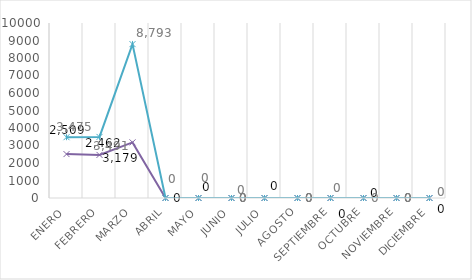
| Category | Series 0 | Series 1 | Series 2 | Series 3 | Series 4 |
|---|---|---|---|---|---|
| Enero |  |  |  | 2509 | 3475 |
| Febrero |  |  |  | 2462 | 3491 |
| Marzo |  |  |  | 3179 | 8793 |
| Abril |  |  |  | 0 | 0 |
| Mayo |  |  |  | 0 | 0 |
| Junio |  |  |  | 0 | 0 |
| Julio |  |  |  | 0 | 0 |
| Agosto |  |  |  | 0 | 0 |
| Septiembre |  |  |  | 0 | 0 |
| Octubre |  |  |  | 0 | 0 |
| Noviembre |  |  |  | 0 | 0 |
| Diciembre |  |  |  | 0 | 0 |